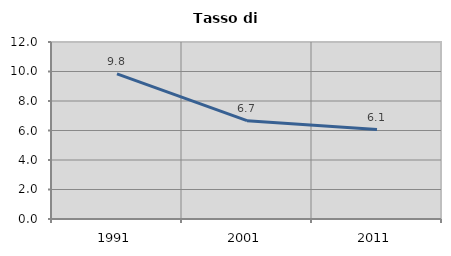
| Category | Tasso di disoccupazione   |
|---|---|
| 1991.0 | 9.836 |
| 2001.0 | 6.667 |
| 2011.0 | 6.061 |